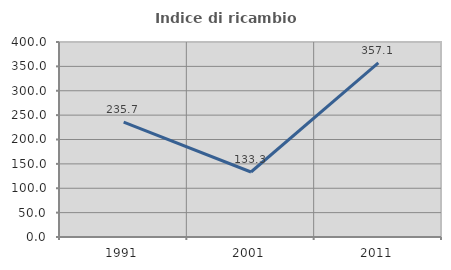
| Category | Indice di ricambio occupazionale  |
|---|---|
| 1991.0 | 235.714 |
| 2001.0 | 133.333 |
| 2011.0 | 357.143 |